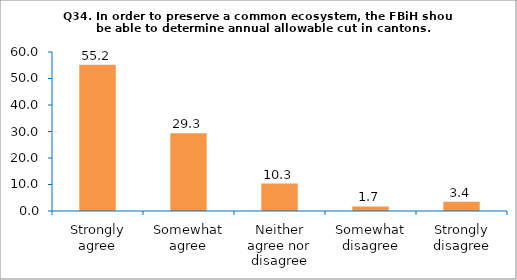
| Category | Series 0 |
|---|---|
| Strongly agree | 55.172 |
| Somewhat agree | 29.31 |
| Neither agree nor disagree | 10.345 |
| Somewhat disagree | 1.724 |
| Strongly disagree | 3.448 |